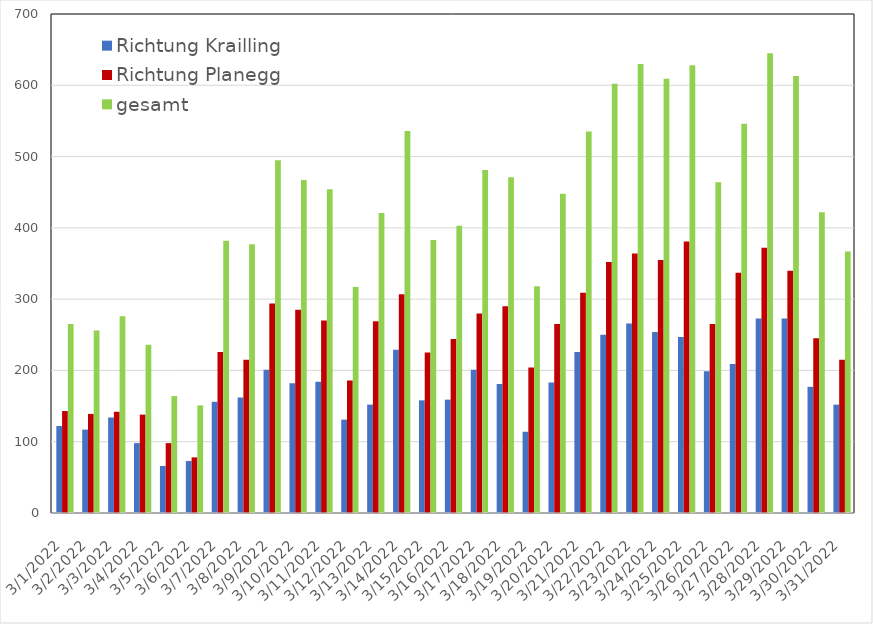
| Category | Richtung Krailling | Richtung Planegg | gesamt |
|---|---|---|---|
| 3/1/22 | 122 | 143 | 265 |
| 3/2/22 | 117 | 139 | 256 |
| 3/3/22 | 134 | 142 | 276 |
| 3/4/22 | 98 | 138 | 236 |
| 3/5/22 | 66 | 98 | 164 |
| 3/6/22 | 73 | 78 | 151 |
| 3/7/22 | 156 | 226 | 382 |
| 3/8/22 | 162 | 215 | 377 |
| 3/9/22 | 201 | 294 | 495 |
| 3/10/22 | 182 | 285 | 467 |
| 3/11/22 | 184 | 270 | 454 |
| 3/12/22 | 131 | 186 | 317 |
| 3/13/22 | 152 | 269 | 421 |
| 3/14/22 | 229 | 307 | 536 |
| 3/15/22 | 158 | 225 | 383 |
| 3/16/22 | 159 | 244 | 403 |
| 3/17/22 | 201 | 280 | 481 |
| 3/18/22 | 181 | 290 | 471 |
| 3/19/22 | 114 | 204 | 318 |
| 3/20/22 | 183 | 265 | 448 |
| 3/21/22 | 226 | 309 | 535 |
| 3/22/22 | 250 | 352 | 602 |
| 3/23/22 | 266 | 364 | 630 |
| 3/24/22 | 254 | 355 | 609 |
| 3/25/22 | 247 | 381 | 628 |
| 3/26/22 | 199 | 265 | 464 |
| 3/27/22 | 209 | 337 | 546 |
| 3/28/22 | 273 | 372 | 645 |
| 3/29/22 | 273 | 340 | 613 |
| 3/30/22 | 177 | 245 | 422 |
| 3/31/22 | 152 | 215 | 367 |